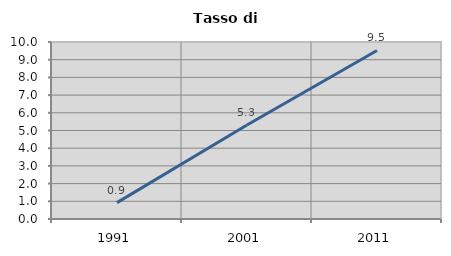
| Category | Tasso di disoccupazione   |
|---|---|
| 1991.0 | 0.926 |
| 2001.0 | 5.31 |
| 2011.0 | 9.524 |